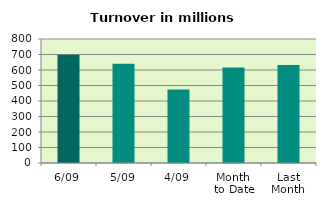
| Category | Series 0 |
|---|---|
| 6/09 | 698.659 |
| 5/09 | 640.534 |
| 4/09 | 474.626 |
| Month 
to Date | 615.945 |
| Last
Month | 632.895 |